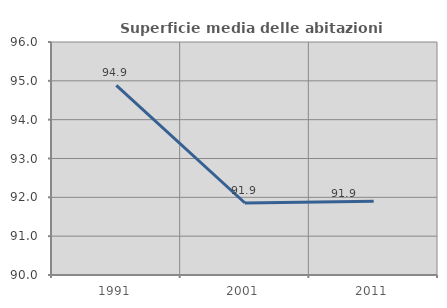
| Category | Superficie media delle abitazioni occupate |
|---|---|
| 1991.0 | 94.881 |
| 2001.0 | 91.854 |
| 2011.0 | 91.902 |